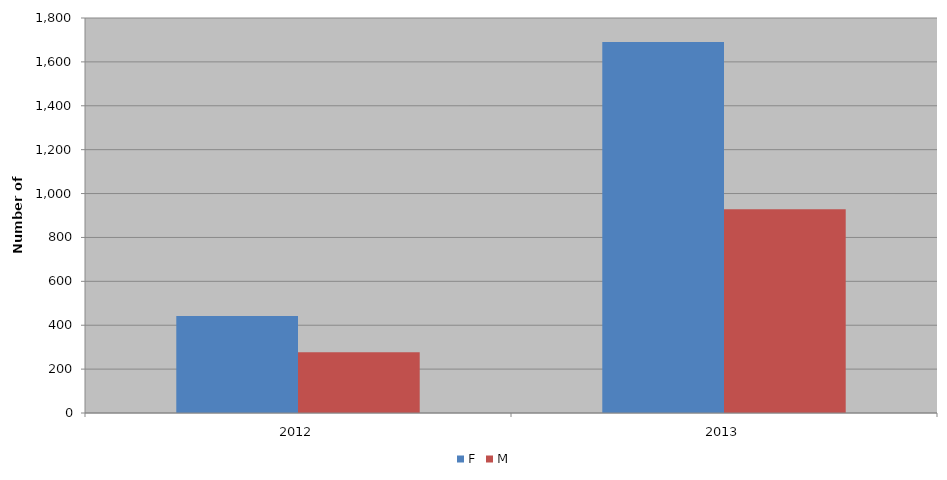
| Category | F | M |
|---|---|---|
| 2012 | 442 | 277 |
| 2013 | 1691 | 929 |